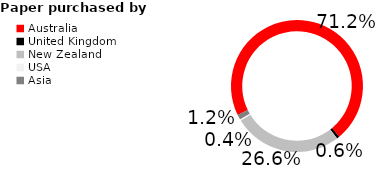
| Category | Paper purchased by geography (%) |
|---|---|
| Australia | 0.712 |
| United Kingdom | 0.006 |
| New Zealand | 0.266 |
| USA | 0.004 |
| Asia | 0.012 |